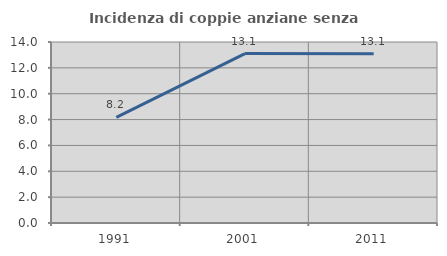
| Category | Incidenza di coppie anziane senza figli  |
|---|---|
| 1991.0 | 8.167 |
| 2001.0 | 13.101 |
| 2011.0 | 13.093 |